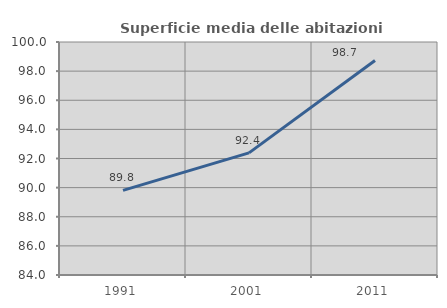
| Category | Superficie media delle abitazioni occupate |
|---|---|
| 1991.0 | 89.811 |
| 2001.0 | 92.388 |
| 2011.0 | 98.727 |